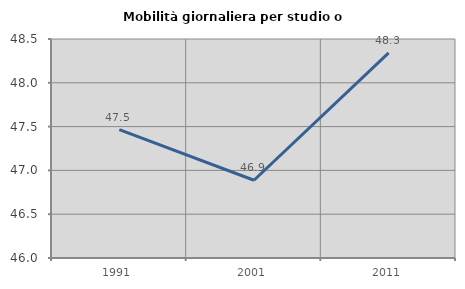
| Category | Mobilità giornaliera per studio o lavoro |
|---|---|
| 1991.0 | 47.465 |
| 2001.0 | 46.887 |
| 2011.0 | 48.343 |